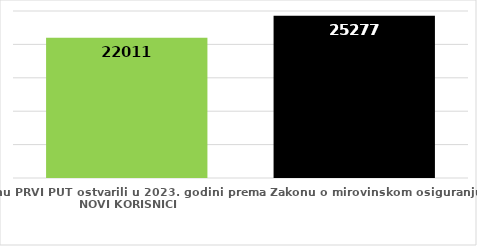
| Category | broj korisnika |
|---|---|
| Korisnici koji su pravo na mirovinu PRVI PUT ostvarili u 2023. godini prema Zakonu o mirovinskom osiguranju - NOVI KORISNICI | 22011 |
| Korisnici mirovina kojima je u 2023. godini PRESTALO PRAVO NA MIROVINU - uzrok smrt 
koji su pravo na mirovinu ostvarili prema Zakonu o mirovinskom osiguranju | 25277 |